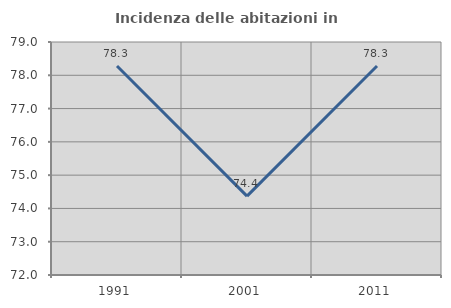
| Category | Incidenza delle abitazioni in proprietà  |
|---|---|
| 1991.0 | 78.277 |
| 2001.0 | 74.368 |
| 2011.0 | 78.277 |